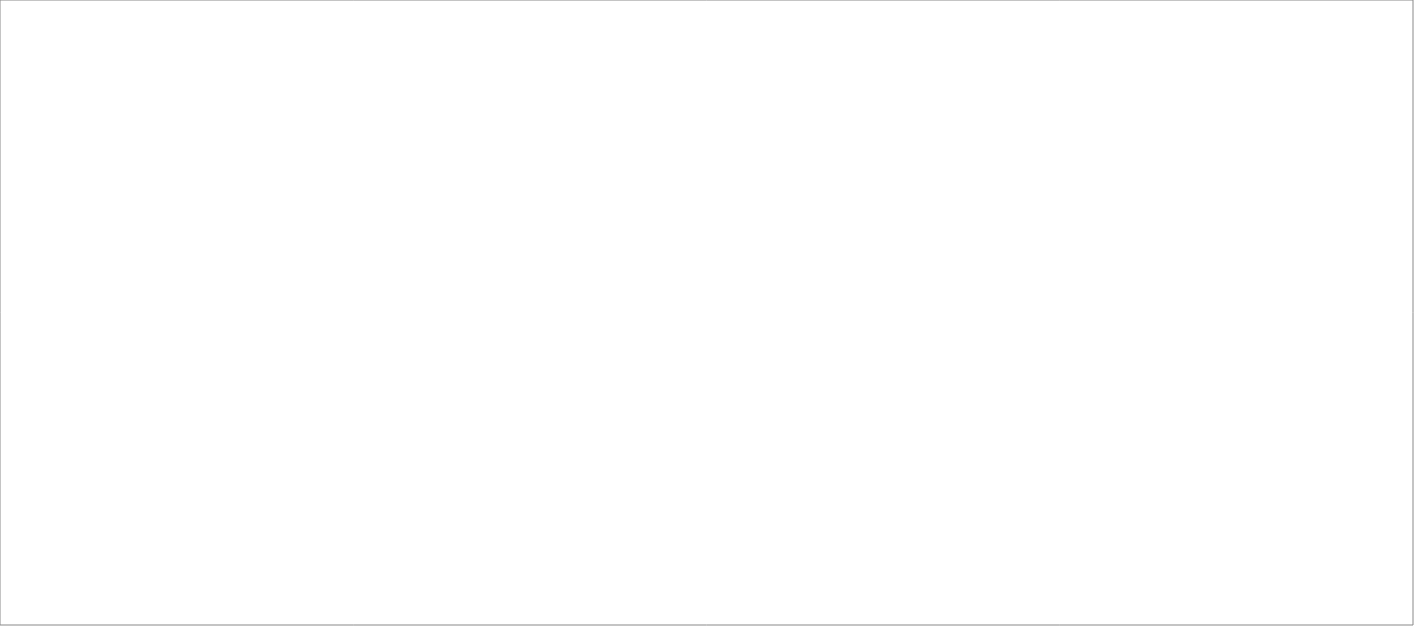
| Category | Total |
|---|---|
| Clockwork Bemanning & Rekrytering AB | 85 |
| Poolia Sverige AB | 85 |
| Randstad AB | 80 |
| Experis AB | 45 |
| Source Executive Recruitment Sweden AB | 25 |